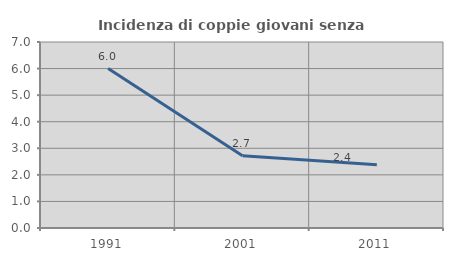
| Category | Incidenza di coppie giovani senza figli |
|---|---|
| 1991.0 | 6 |
| 2001.0 | 2.721 |
| 2011.0 | 2.381 |